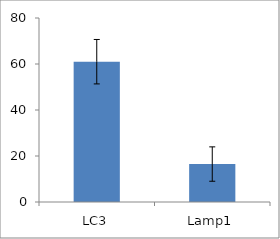
| Category | Series 0 |
|---|---|
| LC3 | 61 |
| Lamp1 | 16.5 |